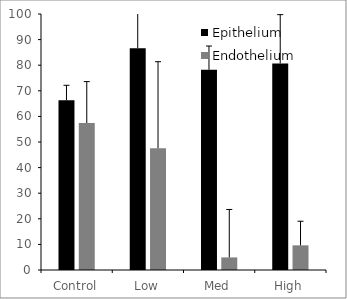
| Category | Epithelium | Endothelium |
|---|---|---|
| Control | 66.268 | 57.426 |
| Low | 86.634 | 47.548 |
| Med | 78.211 | 4.918 |
| High | 80.691 | 9.637 |